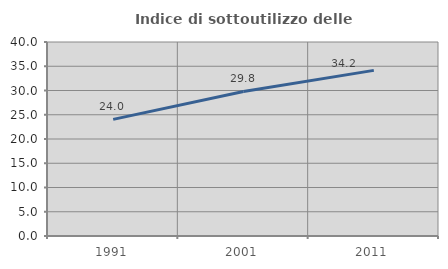
| Category | Indice di sottoutilizzo delle abitazioni  |
|---|---|
| 1991.0 | 24.05 |
| 2001.0 | 29.8 |
| 2011.0 | 34.152 |